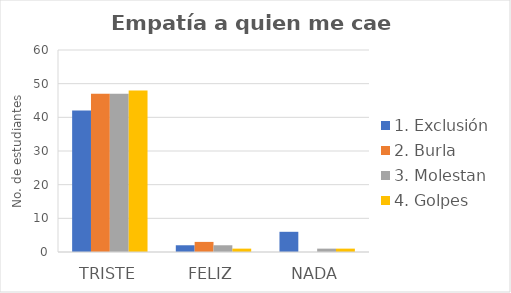
| Category | 1. Exclusión | 2. Burla | 3. Molestan | 4. Golpes |
|---|---|---|---|---|
| Triste | 42 | 47 | 47 | 48 |
| Feliz | 2 | 3 | 2 | 1 |
| Nada | 6 | 0 | 1 | 1 |